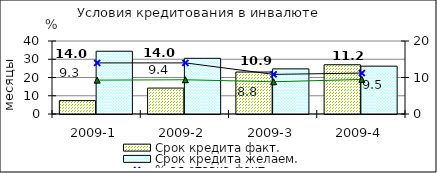
| Category | Срок кредита факт.  | Срок кредита желаем. |
|---|---|---|
| 2009-1 | 7.33 | 34.39 |
| 2009-2 | 14.2 | 30.5 |
| 2009-3 | 23 | 24.73 |
| 2009-4 | 27 | 26.21 |